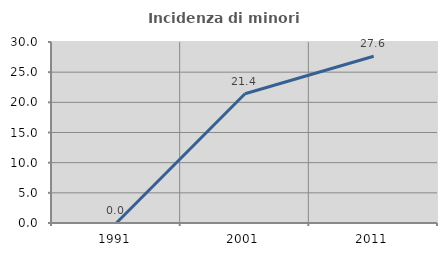
| Category | Incidenza di minori stranieri |
|---|---|
| 1991.0 | 0 |
| 2001.0 | 21.429 |
| 2011.0 | 27.632 |